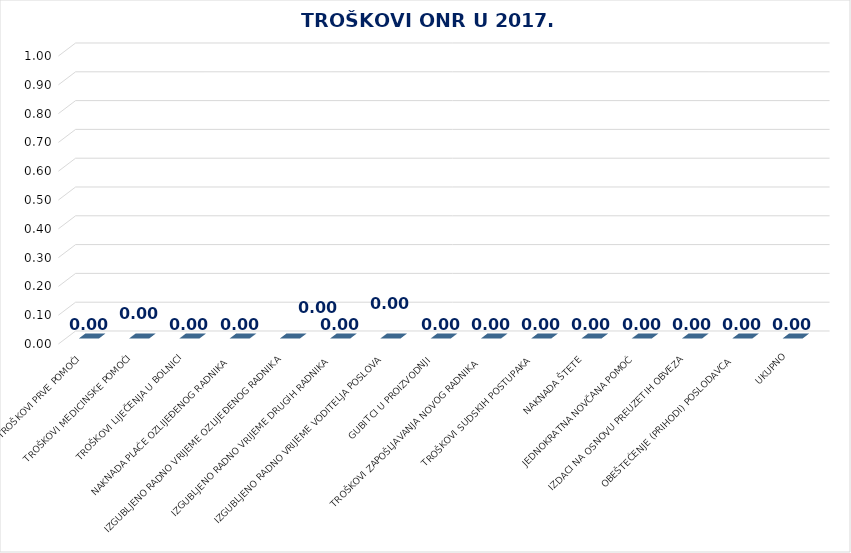
| Category | UKUPNO |
|---|---|
| TROŠKOVI PRVE POMOĆI | 0 |
| TROŠKOVI MEDICINSKE POMOĆI | 0 |
| TROŠKOVI LIJEČENJA U BOLNICI | 0 |
| NAKNADA PLAĆE OZLIJEĐENOG RADNIKA | 0 |
| IZGUBLJENO RADNO VRIJEME OZLIJEĐENOG RADNIKA | 0 |
| IZGUBLJENO RADNO VRIJEME DRUGIH RADNIKA | 0 |
| IZGUBLJENO RADNO VRIJEME VODITELJA POSLOVA | 0 |
| GUBITCI U PROIZVODNJI | 0 |
| TROŠKOVI ZAPOŠLJAVANJA NOVOG RADNIKA | 0 |
| TROŠKOVI SUDSKIH POSTUPAKA | 0 |
| NAKNADA ŠTETE | 0 |
| JEDNOKRATNA NOVČANA POMOĆ | 0 |
| IZDACI NA OSNOVU PREUZETIH OBVEZA | 0 |
| OBEŠTEĆENJE (PRIHODI) POSLODAVCA | 0 |
| UKUPNO | 0 |